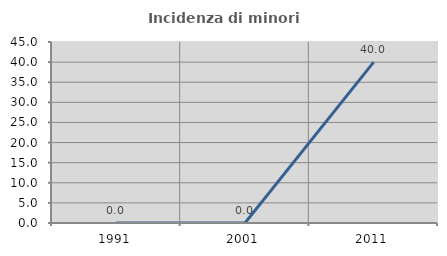
| Category | Incidenza di minori stranieri |
|---|---|
| 1991.0 | 0 |
| 2001.0 | 0 |
| 2011.0 | 40 |